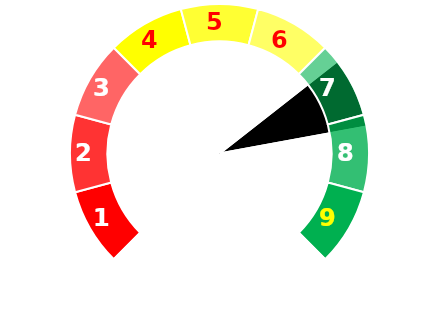
| Category | TRL |
|---|---|
| 0 | 9 |
| 1 | 1 |
| 2 | 2 |